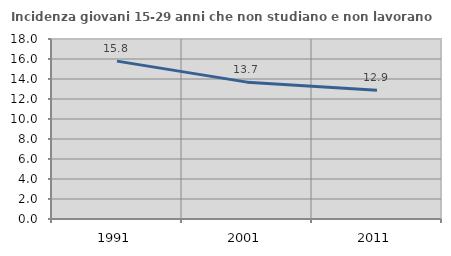
| Category | Incidenza giovani 15-29 anni che non studiano e non lavorano  |
|---|---|
| 1991.0 | 15.787 |
| 2001.0 | 13.687 |
| 2011.0 | 12.877 |